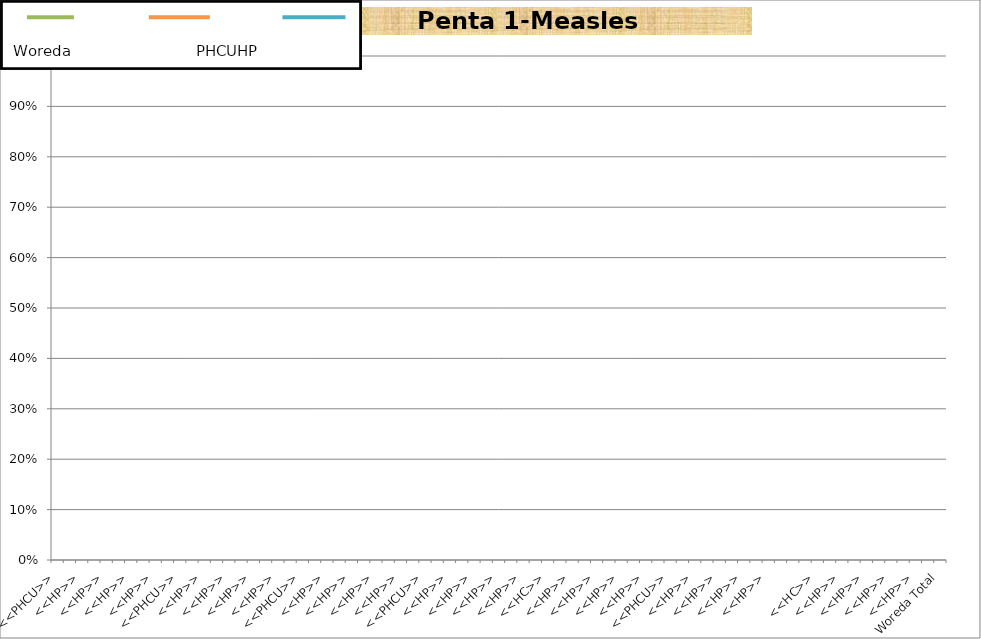
| Category | Penta1-Measles |
|---|---|
| <<PHCU>> | 0 |
| <<HC>> | 0 |
| <<HP>> | 0 |
| <<HP>> | 0 |
| <<HP>> | 0 |
| <<HP>> | 0 |
| <<HP>> | 0 |
| <<HP>> | 0 |
| <<HP>> | 0 |
|  | 0 |
| <<PHCU>> | 0 |
| <<HC>> | 0 |
| <<HP>> | 0 |
| <<HP>> | 0 |
| <<HP>> | 0 |
| <<HP>> | 0 |
| <<HP>> | 0 |
| <<HP>> | 0 |
| <<HP>> | 0 |
|  | 0 |
| <<PHCU>> | 0 |
| <<HC>> | 0 |
| <<HP>> | 0 |
| <<HP>> | 0 |
| <<HP>> | 0 |
| <<HP>> | 0 |
| <<HP>> | 0 |
| <<HP>> | 0 |
| <<HP>> | 0 |
|  | 0 |
| <<PHCU>> | 0 |
| <<HC>> | 0 |
| <<HP>> | 0 |
| <<HP>> | 0 |
| <<HP>> | 0 |
| <<HP>> | 0 |
| <<HP>> | 0 |
| <<HP>> | 0 |
| <<HP>> | 0 |
|  | 0 |
| <<HC>> | 0 |
| <<HP>> | 0 |
| <<HP>> | 0 |
| <<HP>> | 0 |
| <<HP>> | 0 |
| <<HP>> | 0 |
| <<HP>> | 0 |
| <<HP>> | 0 |
| <<HP>> | 0 |
|  | 0 |
| <<PHCU>> | 0 |
| <<HC>> | 0 |
| <<HP>> | 0 |
| <<HP>> | 0 |
| <<HP>> | 0 |
| <<HP>> | 0 |
| <<HP>> | 0 |
| <<HP>> | 0 |
| <<HP>> | 0 |
| <<HP>> | 0 |
|  | 0 |
| <<PHCU>> | 0 |
| <<HC>> | 0 |
| <<HP>> | 0 |
| <<HP>> | 0 |
| <<HP>> | 0 |
| <<HP>> | 0 |
| <<HP>> | 0 |
| <<HP>> | 0 |
| <<HP>> | 0 |
| <<HP>> | 0 |
|  | 0 |
| Woreda Total | 0 |